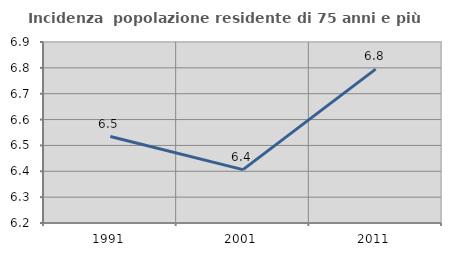
| Category | Incidenza  popolazione residente di 75 anni e più |
|---|---|
| 1991.0 | 6.534 |
| 2001.0 | 6.406 |
| 2011.0 | 6.795 |